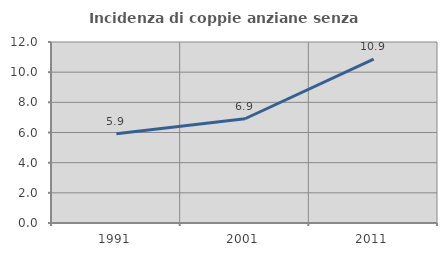
| Category | Incidenza di coppie anziane senza figli  |
|---|---|
| 1991.0 | 5.919 |
| 2001.0 | 6.911 |
| 2011.0 | 10.858 |